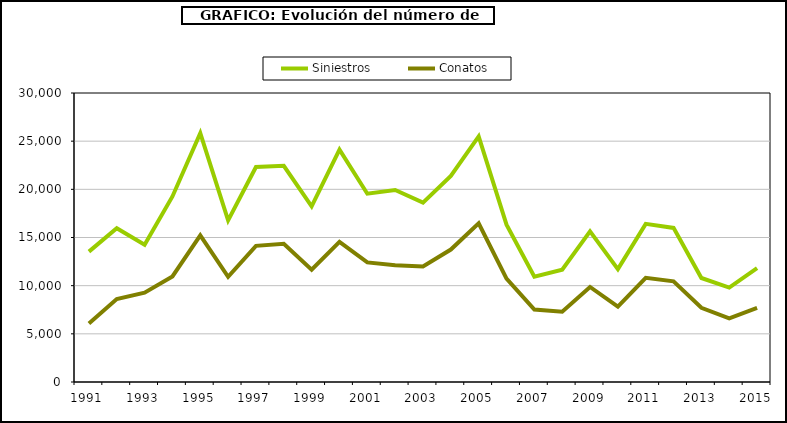
| Category | Siniestros | Conatos |
|---|---|---|
| 1991.0 | 13531 | 6079 |
| 1992.0 | 15955 | 8619 |
| 1993.0 | 14254 | 9269 |
| 1994.0 | 19263 | 10961 |
| 1995.0 | 25827 | 15222 |
| 1996.0 | 16771 | 10918 |
| 1997.0 | 22320 | 14136 |
| 1998.0 | 22446 | 14343 |
| 1999.0 | 18237 | 11650 |
| 2000.0 | 24118 | 14547 |
| 2001.0 | 19547 | 12415 |
| 2002.0 | 19929 | 12111 |
| 2003.0 | 18616 | 11982 |
| 2004.0 | 21396 | 13750 |
| 2005.0 | 25492 | 16475 |
| 2006.0 | 16334 | 10741 |
| 2007.0 | 10932 | 7523 |
| 2008.0 | 11656 | 7301 |
| 2009.0 | 15642 | 9866 |
| 2010.0 | 11722 | 7812 |
| 2011.0 | 16414 | 10815 |
| 2012.0 | 15997 | 10455 |
| 2013.0 | 10797 | 7708 |
| 2014.0 | 9806 | 6610 |
| 2015.0 | 11810 | 7685 |